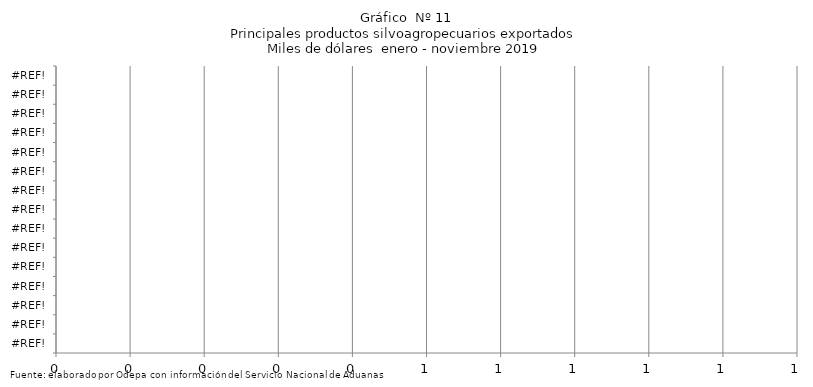
| Category | Series 0 |
|---|---|
| 0.0 | 0 |
| 0.0 | 0 |
| 0.0 | 0 |
| 0.0 | 0 |
| 0.0 | 0 |
| 0.0 | 0 |
| 0.0 | 0 |
| 0.0 | 0 |
| 0.0 | 0 |
| 0.0 | 0 |
| 0.0 | 0 |
| 0.0 | 0 |
| 0.0 | 0 |
| 0.0 | 0 |
| 0.0 | 0 |